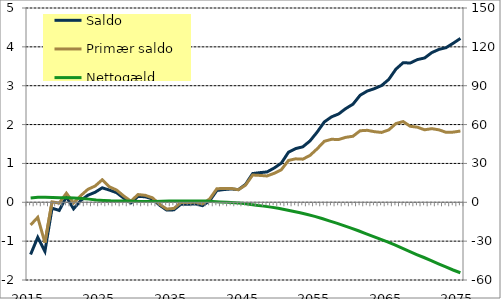
| Category | Saldo | Primær saldo |
|---|---|---|
| 2015-01-01 | -1.343 | -0.585 |
| 2016-01-01 | -0.903 | -0.388 |
| 2017-01-01 | -1.263 | -1.04 |
| 2018-01-01 | -0.152 | 0.011 |
| 2019-01-01 | -0.21 | -0.02 |
| 2020-01-01 | 0.142 | 0.234 |
| 2021-01-01 | -0.169 | -0.019 |
| 2022-01-01 | 0.046 | 0.17 |
| 2023-01-01 | 0.182 | 0.334 |
| 2024-01-01 | 0.257 | 0.417 |
| 2025-01-01 | 0.372 | 0.578 |
| 2026-01-01 | 0.314 | 0.399 |
| 2027-01-01 | 0.248 | 0.315 |
| 2028-01-01 | 0.108 | 0.162 |
| 2029-01-01 | -0.018 | 0.029 |
| 2030-01-01 | 0.153 | 0.199 |
| 2031-01-01 | 0.142 | 0.18 |
| 2032-01-01 | 0.087 | 0.117 |
| 2033-01-01 | -0.074 | -0.049 |
| 2034-01-01 | -0.201 | -0.173 |
| 2035-01-01 | -0.194 | -0.159 |
| 2036-01-01 | -0.047 | -0.004 |
| 2037-01-01 | -0.053 | -0.009 |
| 2038-01-01 | -0.041 | 0.004 |
| 2039-01-01 | -0.087 | -0.041 |
| 2040-01-01 | 0.039 | 0.087 |
| 2041-01-01 | 0.304 | 0.348 |
| 2042-01-01 | 0.328 | 0.357 |
| 2043-01-01 | 0.343 | 0.356 |
| 2044-01-01 | 0.326 | 0.323 |
| 2045-01-01 | 0.459 | 0.441 |
| 2046-01-01 | 0.74 | 0.702 |
| 2047-01-01 | 0.763 | 0.692 |
| 2048-01-01 | 0.781 | 0.678 |
| 2049-01-01 | 0.881 | 0.746 |
| 2050-01-01 | 1.008 | 0.837 |
| 2051-01-01 | 1.288 | 1.077 |
| 2052-01-01 | 1.382 | 1.118 |
| 2053-01-01 | 1.427 | 1.11 |
| 2054-01-01 | 1.578 | 1.206 |
| 2055-01-01 | 1.806 | 1.376 |
| 2056-01-01 | 2.068 | 1.569 |
| 2057-01-01 | 2.198 | 1.621 |
| 2058-01-01 | 2.273 | 1.616 |
| 2059-01-01 | 2.412 | 1.672 |
| 2060-01-01 | 2.524 | 1.699 |
| 2061-01-01 | 2.754 | 1.841 |
| 2062-01-01 | 2.863 | 1.852 |
| 2063-01-01 | 2.925 | 1.817 |
| 2064-01-01 | 3.005 | 1.798 |
| 2065-01-01 | 3.162 | 1.863 |
| 2066-01-01 | 3.427 | 2.026 |
| 2067-01-01 | 3.591 | 2.077 |
| 2068-01-01 | 3.585 | 1.956 |
| 2069-01-01 | 3.673 | 1.932 |
| 2070-01-01 | 3.714 | 1.866 |
| 2071-01-01 | 3.852 | 1.895 |
| 2072-01-01 | 3.934 | 1.865 |
| 2073-01-01 | 3.979 | 1.8 |
| 2074-01-01 | 4.094 | 1.806 |
| 2075-01-01 | 4.217 | 1.833 |